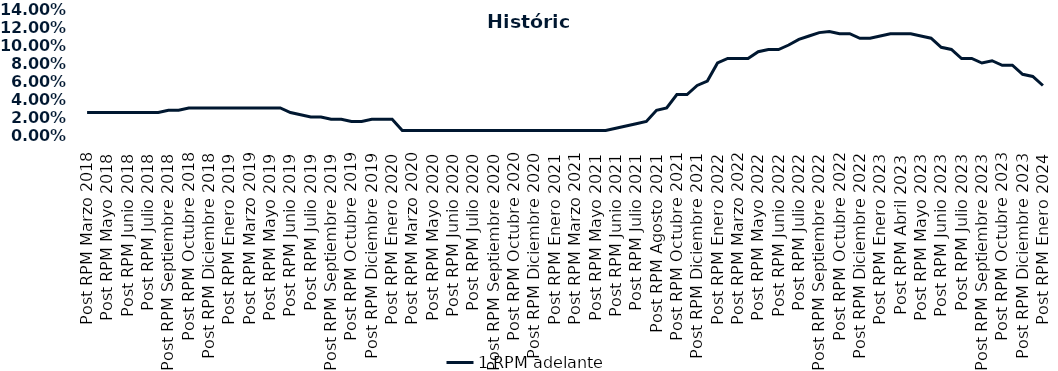
| Category | 1 RPM adelante |
|---|---|
| Post RPM Marzo 2018 | 0.025 |
| Pre RPM Mayo 2018 | 0.025 |
| Post RPM Mayo 2018 | 0.025 |
| Pre RPM Junio 2018 | 0.025 |
| Post RPM Junio 2018 | 0.025 |
| Pre RPM Julio 2018 | 0.025 |
| Post RPM Julio 2018 | 0.025 |
| Pre RPM Septiembre 2018 | 0.025 |
| Post RPM Septiembre 2018 | 0.028 |
| Pre RPM Octubre 2018 | 0.028 |
| Post RPM Octubre 2018 | 0.03 |
| Pre RPM Diciembre 2018 | 0.03 |
| Post RPM Diciembre 2018 | 0.03 |
| Pre RPM Enero 2019 | 0.03 |
| Post RPM Enero 2019 | 0.03 |
| Pre RPM Marzo 2019 | 0.03 |
| Post RPM Marzo 2019 | 0.03 |
| Pre RPM Mayo 2019 | 0.03 |
| Post RPM Mayo 2019 | 0.03 |
| Pre RPM Junio 2019 | 0.03 |
| Post RPM Junio 2019 | 0.025 |
| Pre RPM Julio 2019 | 0.022 |
| Post RPM Julio 2019 | 0.02 |
| Pre RPM Septiembre 2019 | 0.02 |
| Post RPM Septiembre 2019 | 0.018 |
| Pre RPM Octubre 2019 | 0.018 |
| Post RPM Octubre 2019 | 0.015 |
| Pre RPM Diciembre 2019 | 0.015 |
| Post RPM Diciembre 2019 | 0.018 |
| Pre RPM Enero 2020 | 0.018 |
| Post RPM Enero 2020 | 0.018 |
| Pre RPM Marzo 2020 | 0.005 |
| Post RPM Marzo 2020 | 0.005 |
| Pre RPM Mayo 2020 | 0.005 |
| Post RPM Mayo 2020 | 0.005 |
| Pre RPM Junio 2020 | 0.005 |
| Post RPM Junio 2020 | 0.005 |
| Pre RPM Julio 2020 | 0.005 |
| Post RPM Julio 2020 | 0.005 |
| Pre RPM Septiembre 2020 | 0.005 |
| Post RPM Septiembre 2020 | 0.005 |
| Pre RPM Octubre 2020 | 0.005 |
| Post RPM Octubre 2020 | 0.005 |
| Pre RPM Diciembre 2020 | 0.005 |
| Post RPM Diciembre 2020 | 0.005 |
| Pre RPM Enero 2021 | 0.005 |
| Post RPM Enero 2021 | 0.005 |
| Pre RPM Marzo 2021 | 0.005 |
| Post RPM Marzo 2021 | 0.005 |
| Pre RPM Mayo 2021 | 0.005 |
| Post RPM Mayo 2021 | 0.005 |
| Pre RPM Junio 2021 | 0.005 |
| Post RPM Junio 2021 | 0.008 |
| Pre RPM Julio 2021 | 0.01 |
| Post RPM Julio 2021 | 0.012 |
| Pre RPM Agosto 2021 | 0.015 |
| Post RPM Agosto 2021 | 0.028 |
| Pre RPM Octubre 2021 | 0.03 |
| Post RPM Octubre 2021 | 0.045 |
| Pre RPM Diciembre 2021 | 0.045 |
| Post RPM Diciembre 2021 | 0.055 |
| Pre RPM Enero 2022 | 0.06 |
| Post RPM Enero 2022 | 0.08 |
| Pre RPM Marzo 2022 | 0.085 |
| Post RPM Marzo 2022 | 0.085 |
| Pre RPM Mayo 2022 | 0.085 |
| Post RPM Mayo 2022 | 0.092 |
| Pre RPM Junio 2022 | 0.095 |
| Post RPM Junio 2022 | 0.095 |
| Pre RPM Julio 2022 | 0.1 |
| Post RPM Julio 2022 | 0.106 |
| Pre RPM Septiembre 2022 | 0.11 |
| Post RPM Septiembre 2022 | 0.114 |
| Pre RPM Octubre 2022 | 0.115 |
| Post RPM Octubre 2022 | 0.112 |
| Pre RPM Diciembre 2022 | 0.112 |
| Post RPM Diciembre 2022 | 0.108 |
| Pre RPM Enero 2023 | 0.108 |
| Post RPM Enero 2023 | 0.11 |
| Pre RPM Abril 2023 | 0.112 |
| Post RPM Abril 2023 | 0.112 |
| Pre RPM Mayo 2023 | 0.112 |
| Post RPM Mayo 2023 | 0.11 |
| Pre RPM Junio 2023 | 0.108 |
| Post RPM Junio 2023 | 0.098 |
| Pre RPM Julio 2023 | 0.095 |
| Post RPM Julio 2023 | 0.085 |
| Pre RPM Septiembre 2023 | 0.085 |
| Post RPM Septiembre 2023 | 0.08 |
| Pre RPM Octubre 2023 | 0.082 |
| Post RPM Octubre 2023 | 0.078 |
| Pre RPM Diciembre 2023 | 0.078 |
| Post RPM Diciembre 2023 | 0.068 |
| Pre RPM Enero 2024 | 0.065 |
| Post RPM Enero 2024 | 0.055 |